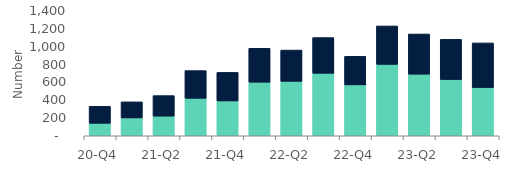
| Category | Homeowners | Buy-to-let |
|---|---|---|
| 20-Q4 | 140 | 190 |
| 21-Q1 | 200 | 180 |
| 21-Q2 | 220 | 230 |
| 21-Q3 | 420 | 310 |
| 21-Q4 | 390 | 320 |
| 22-Q1 | 600 | 380 |
| 22-Q2 | 610 | 350 |
| 22-Q3 | 700 | 400 |
| 22-Q4 | 570 | 320 |
| 23-Q1 | 800 | 430 |
| 23-Q2 | 690 | 450 |
| 23-Q3 | 630 | 450 |
| 23-Q4 | 540 | 500 |